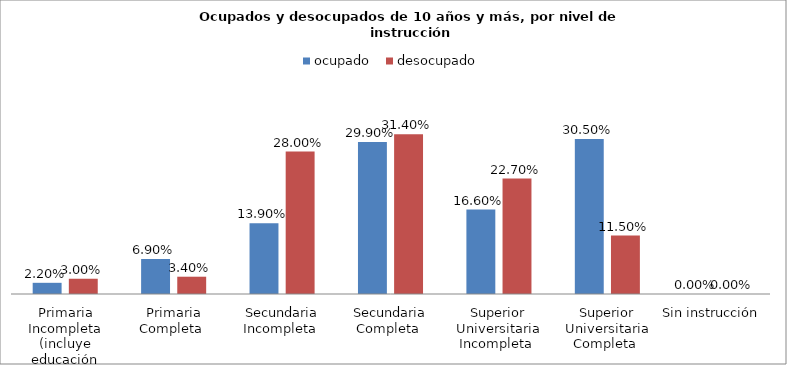
| Category | ocupado  | desocupado |
|---|---|---|
| Primaria Incompleta (incluye educación especial) | 0.022 | 0.03 |
| Primaria Completa  | 0.069 | 0.034 |
| Secundaria Incompleta  | 0.139 | 0.28 |
| Secundaria Completa  | 0.299 | 0.314 |
| Superior Universitaria Incompleta  | 0.166 | 0.227 |
| Superior Universitaria Completa  | 0.305 | 0.115 |
| Sin instrucción  | 0 | 0 |